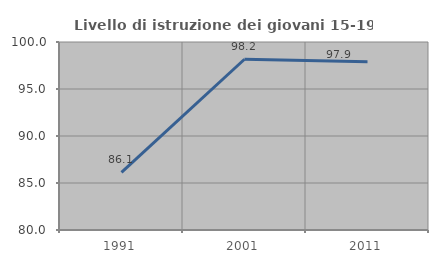
| Category | Livello di istruzione dei giovani 15-19 anni |
|---|---|
| 1991.0 | 86.131 |
| 2001.0 | 98.165 |
| 2011.0 | 97.906 |